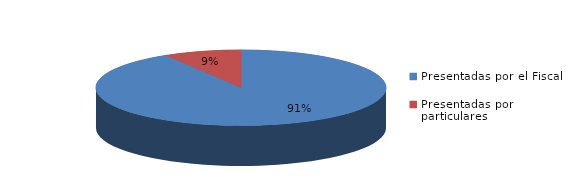
| Category | Series 0 |
|---|---|
| Presentadas por el Fiscal | 127 |
| Presentadas por particulares | 12 |